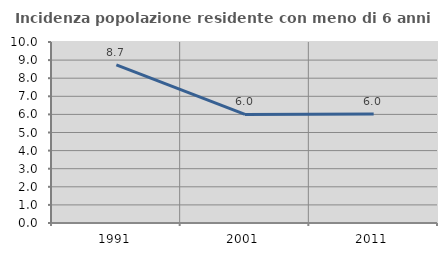
| Category | Incidenza popolazione residente con meno di 6 anni |
|---|---|
| 1991.0 | 8.735 |
| 2001.0 | 5.997 |
| 2011.0 | 6.028 |